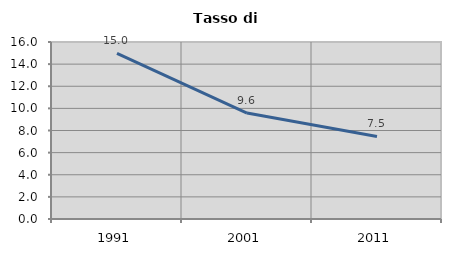
| Category | Tasso di disoccupazione   |
|---|---|
| 1991.0 | 14.965 |
| 2001.0 | 9.573 |
| 2011.0 | 7.458 |